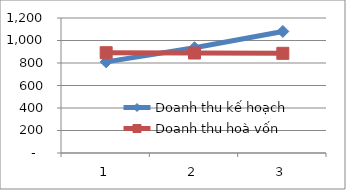
| Category | Doanh thu kế hoạch | Doanh thu hoà vốn |
|---|---|---|
| 0 | 810 | 891.333 |
| 1 | 935.55 | 888.667 |
| 2 | 1080.56 | 886 |